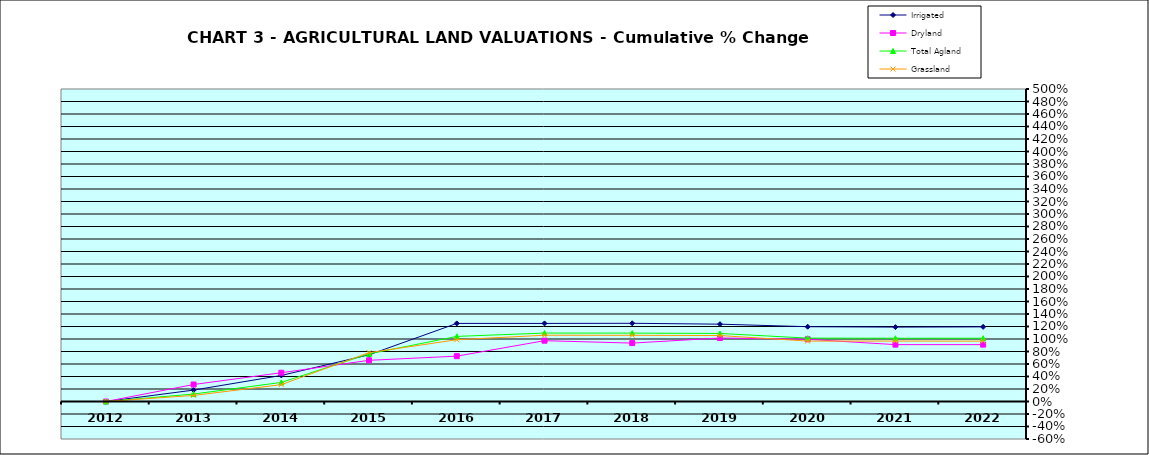
| Category | Irrigated | Dryland | Total Agland | Grassland |
|---|---|---|---|---|
| 2012.0 | 0 | 0 | 0 | 0 |
| 2013.0 | 0.182 | 0.272 | 0.119 | 0.097 |
| 2014.0 | 0.417 | 0.46 | 0.305 | 0.27 |
| 2015.0 | 0.747 | 0.659 | 0.762 | 0.782 |
| 2016.0 | 1.249 | 0.726 | 1.041 | 0.988 |
| 2017.0 | 1.249 | 0.973 | 1.095 | 1.06 |
| 2018.0 | 1.251 | 0.934 | 1.094 | 1.059 |
| 2019.0 | 1.237 | 1.016 | 1.089 | 1.055 |
| 2020.0 | 1.197 | 0.995 | 1.014 | 0.967 |
| 2021.0 | 1.19 | 0.91 | 1.012 | 0.967 |
| 2022.0 | 1.194 | 0.91 | 1.012 | 0.966 |